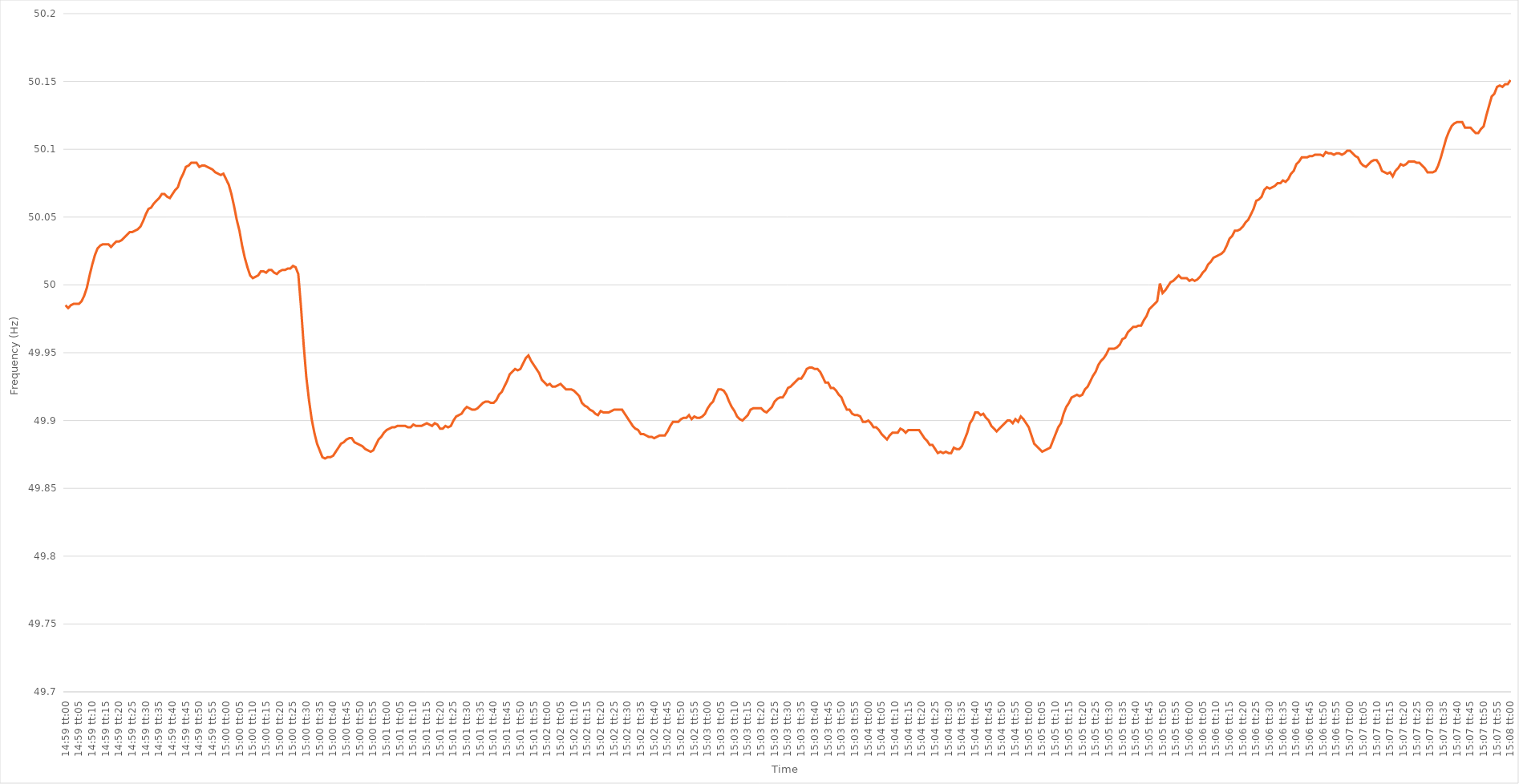
| Category | Series 0 |
|---|---|
| 0.6243055555555556 | 49.985 |
| 0.6243171296296296 | 49.983 |
| 0.6243287037037036 | 49.985 |
| 0.6243402777777778 | 49.986 |
| 0.6243518518518518 | 49.986 |
| 0.624363425925926 | 49.986 |
| 0.624375 | 49.988 |
| 0.624386574074074 | 49.992 |
| 0.6243981481481481 | 49.998 |
| 0.6244097222222222 | 50.007 |
| 0.6244212962962963 | 50.015 |
| 0.6244328703703704 | 50.022 |
| 0.6244444444444445 | 50.027 |
| 0.6244560185185185 | 50.029 |
| 0.6244675925925925 | 50.03 |
| 0.6244791666666667 | 50.03 |
| 0.6244907407407407 | 50.03 |
| 0.6245023148148149 | 50.028 |
| 0.6245138888888889 | 50.03 |
| 0.624525462962963 | 50.032 |
| 0.624537037037037 | 50.032 |
| 0.624548611111111 | 50.033 |
| 0.6245601851851852 | 50.035 |
| 0.6245717592592592 | 50.037 |
| 0.6245833333333334 | 50.039 |
| 0.6245949074074074 | 50.039 |
| 0.6246064814814815 | 50.04 |
| 0.6246180555555555 | 50.041 |
| 0.6246296296296296 | 50.043 |
| 0.6246412037037037 | 50.047 |
| 0.6246527777777778 | 50.052 |
| 0.6246643518518519 | 50.056 |
| 0.6246759259259259 | 50.057 |
| 0.6246875 | 50.06 |
| 0.6246990740740741 | 50.062 |
| 0.6247106481481481 | 50.064 |
| 0.6247222222222223 | 50.067 |
| 0.6247337962962963 | 50.067 |
| 0.6247453703703704 | 50.065 |
| 0.6247569444444444 | 50.064 |
| 0.6247685185185184 | 50.067 |
| 0.6247800925925926 | 50.07 |
| 0.6247916666666666 | 50.072 |
| 0.6248032407407408 | 50.078 |
| 0.6248148148148148 | 50.082 |
| 0.6248263888888889 | 50.087 |
| 0.6248379629629629 | 50.088 |
| 0.624849537037037 | 50.09 |
| 0.6248611111111111 | 50.09 |
| 0.6248726851851852 | 50.09 |
| 0.6248842592592593 | 50.087 |
| 0.6248958333333333 | 50.088 |
| 0.6249074074074074 | 50.088 |
| 0.6249189814814815 | 50.087 |
| 0.6249305555555555 | 50.086 |
| 0.6249421296296297 | 50.085 |
| 0.6249537037037037 | 50.083 |
| 0.6249652777777778 | 50.082 |
| 0.6249768518518518 | 50.081 |
| 0.624988425925926 | 50.082 |
| 0.625 | 50.078 |
| 0.625011574074074 | 50.074 |
| 0.6250231481481482 | 50.067 |
| 0.6250347222222222 | 50.058 |
| 0.6250462962962963 | 50.048 |
| 0.6250578703703703 | 50.04 |
| 0.6250694444444445 | 50.029 |
| 0.6250810185185185 | 50.02 |
| 0.6250925925925926 | 50.013 |
| 0.6251041666666667 | 50.007 |
| 0.6251157407407407 | 50.005 |
| 0.6251273148148148 | 50.006 |
| 0.6251388888888889 | 50.007 |
| 0.625150462962963 | 50.01 |
| 0.6251620370370371 | 50.01 |
| 0.6251736111111111 | 50.009 |
| 0.6251851851851852 | 50.011 |
| 0.6251967592592592 | 50.011 |
| 0.6252083333333334 | 50.009 |
| 0.6252199074074074 | 50.008 |
| 0.6252314814814816 | 50.01 |
| 0.6252430555555556 | 50.011 |
| 0.6252546296296296 | 50.011 |
| 0.6252662037037037 | 50.012 |
| 0.6252777777777777 | 50.012 |
| 0.6252893518518519 | 50.014 |
| 0.6253009259259259 | 50.013 |
| 0.6253125 | 50.008 |
| 0.6253240740740741 | 49.984 |
| 0.6253356481481481 | 49.956 |
| 0.6253472222222222 | 49.932 |
| 0.6253587962962963 | 49.915 |
| 0.6253703703703704 | 49.901 |
| 0.6253819444444445 | 49.891 |
| 0.6253935185185185 | 49.883 |
| 0.6254050925925926 | 49.878 |
| 0.6254166666666666 | 49.873 |
| 0.6254282407407408 | 49.872 |
| 0.6254398148148148 | 49.873 |
| 0.625451388888889 | 49.873 |
| 0.625462962962963 | 49.874 |
| 0.625474537037037 | 49.877 |
| 0.6254861111111111 | 49.88 |
| 0.6254976851851851 | 49.883 |
| 0.6255092592592593 | 49.884 |
| 0.6255208333333333 | 49.886 |
| 0.6255324074074075 | 49.887 |
| 0.6255439814814815 | 49.887 |
| 0.6255555555555555 | 49.884 |
| 0.6255671296296296 | 49.883 |
| 0.6255787037037037 | 49.882 |
| 0.6255902777777778 | 49.881 |
| 0.6256018518518519 | 49.879 |
| 0.625613425925926 | 49.878 |
| 0.625625 | 49.877 |
| 0.625636574074074 | 49.878 |
| 0.6256481481481482 | 49.882 |
| 0.6256597222222222 | 49.886 |
| 0.6256712962962964 | 49.888 |
| 0.6256828703703704 | 49.891 |
| 0.6256944444444444 | 49.893 |
| 0.6257060185185185 | 49.894 |
| 0.6257175925925925 | 49.895 |
| 0.6257291666666667 | 49.895 |
| 0.6257407407407407 | 49.896 |
| 0.6257523148148149 | 49.896 |
| 0.6257638888888889 | 49.896 |
| 0.6257754629629629 | 49.896 |
| 0.625787037037037 | 49.895 |
| 0.6257986111111111 | 49.895 |
| 0.6258101851851852 | 49.897 |
| 0.6258217592592593 | 49.896 |
| 0.6258333333333334 | 49.896 |
| 0.6258449074074074 | 49.896 |
| 0.6258564814814814 | 49.897 |
| 0.6258680555555556 | 49.898 |
| 0.6258796296296296 | 49.897 |
| 0.6258912037037038 | 49.896 |
| 0.6259027777777778 | 49.898 |
| 0.6259143518518518 | 49.897 |
| 0.6259259259259259 | 49.894 |
| 0.6259375 | 49.894 |
| 0.6259490740740741 | 49.896 |
| 0.6259606481481481 | 49.895 |
| 0.6259722222222223 | 49.896 |
| 0.6259837962962963 | 49.9 |
| 0.6259953703703703 | 49.903 |
| 0.6260069444444444 | 49.904 |
| 0.6260185185185185 | 49.905 |
| 0.6260300925925926 | 49.908 |
| 0.6260416666666667 | 49.91 |
| 0.6260532407407408 | 49.909 |
| 0.6260648148148148 | 49.908 |
| 0.6260763888888888 | 49.908 |
| 0.626087962962963 | 49.909 |
| 0.626099537037037 | 49.911 |
| 0.6261111111111112 | 49.913 |
| 0.6261226851851852 | 49.914 |
| 0.6261342592592593 | 49.914 |
| 0.6261458333333333 | 49.913 |
| 0.6261574074074074 | 49.913 |
| 0.6261689814814815 | 49.915 |
| 0.6261805555555556 | 49.919 |
| 0.6261921296296297 | 49.921 |
| 0.6262037037037037 | 49.925 |
| 0.6262152777777777 | 49.929 |
| 0.6262268518518518 | 49.934 |
| 0.6262384259259259 | 49.936 |
| 0.62625 | 49.938 |
| 0.6262615740740741 | 49.937 |
| 0.6262731481481482 | 49.938 |
| 0.6262847222222222 | 49.942 |
| 0.6262962962962962 | 49.946 |
| 0.6263078703703704 | 49.948 |
| 0.6263194444444444 | 49.944 |
| 0.6263310185185186 | 49.941 |
| 0.6263425925925926 | 49.938 |
| 0.6263541666666667 | 49.935 |
| 0.6263657407407407 | 49.93 |
| 0.6263773148148148 | 49.928 |
| 0.6263888888888889 | 49.926 |
| 0.626400462962963 | 49.927 |
| 0.6264120370370371 | 49.925 |
| 0.6264236111111111 | 49.925 |
| 0.6264351851851852 | 49.926 |
| 0.6264467592592592 | 49.927 |
| 0.6264583333333333 | 49.925 |
| 0.6264699074074074 | 49.923 |
| 0.6264814814814815 | 49.923 |
| 0.6264930555555556 | 49.923 |
| 0.6265046296296296 | 49.922 |
| 0.6265162037037036 | 49.92 |
| 0.6265277777777778 | 49.918 |
| 0.6265393518518518 | 49.913 |
| 0.626550925925926 | 49.911 |
| 0.6265625 | 49.91 |
| 0.6265740740740741 | 49.908 |
| 0.6265856481481481 | 49.907 |
| 0.6265972222222222 | 49.905 |
| 0.6266087962962963 | 49.904 |
| 0.6266203703703704 | 49.907 |
| 0.6266319444444445 | 49.906 |
| 0.6266435185185185 | 49.906 |
| 0.6266550925925926 | 49.906 |
| 0.6266666666666666 | 49.907 |
| 0.6266782407407407 | 49.908 |
| 0.6266898148148148 | 49.908 |
| 0.6267013888888889 | 49.908 |
| 0.626712962962963 | 49.908 |
| 0.626724537037037 | 49.905 |
| 0.626736111111111 | 49.902 |
| 0.6267476851851852 | 49.899 |
| 0.6267592592592592 | 49.896 |
| 0.6267708333333334 | 49.894 |
| 0.6267824074074074 | 49.893 |
| 0.6267939814814815 | 49.89 |
| 0.6268055555555555 | 49.89 |
| 0.6268171296296297 | 49.889 |
| 0.6268287037037037 | 49.888 |
| 0.6268402777777778 | 49.888 |
| 0.6268518518518519 | 49.887 |
| 0.6268634259259259 | 49.888 |
| 0.626875 | 49.889 |
| 0.6268865740740741 | 49.889 |
| 0.6268981481481481 | 49.889 |
| 0.6269097222222222 | 49.892 |
| 0.6269212962962963 | 49.896 |
| 0.6269328703703704 | 49.899 |
| 0.6269444444444444 | 49.899 |
| 0.6269560185185185 | 49.899 |
| 0.6269675925925926 | 49.901 |
| 0.6269791666666666 | 49.902 |
| 0.6269907407407408 | 49.902 |
| 0.6270023148148148 | 49.904 |
| 0.6270138888888889 | 49.901 |
| 0.6270254629629629 | 49.903 |
| 0.6270370370370371 | 49.902 |
| 0.6270486111111111 | 49.902 |
| 0.6270601851851852 | 49.903 |
| 0.6270717592592593 | 49.905 |
| 0.6270833333333333 | 49.909 |
| 0.6270949074074074 | 49.912 |
| 0.6271064814814815 | 49.914 |
| 0.6271180555555556 | 49.919 |
| 0.6271296296296297 | 49.923 |
| 0.6271412037037037 | 49.923 |
| 0.6271527777777778 | 49.922 |
| 0.6271643518518518 | 49.919 |
| 0.6271759259259259 | 49.914 |
| 0.6271875 | 49.91 |
| 0.627199074074074 | 49.907 |
| 0.6272106481481482 | 49.903 |
| 0.6272222222222222 | 49.901 |
| 0.6272337962962963 | 49.9 |
| 0.6272453703703703 | 49.902 |
| 0.6272569444444445 | 49.904 |
| 0.6272685185185185 | 49.908 |
| 0.6272800925925927 | 49.909 |
| 0.6272916666666667 | 49.909 |
| 0.6273032407407407 | 49.909 |
| 0.6273148148148148 | 49.909 |
| 0.6273263888888889 | 49.907 |
| 0.627337962962963 | 49.906 |
| 0.6273495370370371 | 49.908 |
| 0.6273611111111111 | 49.91 |
| 0.6273726851851852 | 49.914 |
| 0.6273842592592592 | 49.916 |
| 0.6273958333333333 | 49.917 |
| 0.6274074074074074 | 49.917 |
| 0.6274189814814815 | 49.92 |
| 0.6274305555555556 | 49.924 |
| 0.6274421296296296 | 49.925 |
| 0.6274537037037037 | 49.927 |
| 0.6274652777777777 | 49.929 |
| 0.6274768518518519 | 49.931 |
| 0.6274884259259259 | 49.931 |
| 0.6275000000000001 | 49.934 |
| 0.6275115740740741 | 49.938 |
| 0.6275231481481481 | 49.939 |
| 0.6275347222222222 | 49.939 |
| 0.6275462962962963 | 49.938 |
| 0.6275578703703704 | 49.938 |
| 0.6275694444444445 | 49.936 |
| 0.6275810185185186 | 49.932 |
| 0.6275925925925926 | 49.928 |
| 0.6276041666666666 | 49.928 |
| 0.6276157407407407 | 49.924 |
| 0.6276273148148148 | 49.924 |
| 0.6276388888888889 | 49.922 |
| 0.627650462962963 | 49.919 |
| 0.627662037037037 | 49.917 |
| 0.6276736111111111 | 49.912 |
| 0.6276851851851851 | 49.908 |
| 0.6276967592592593 | 49.908 |
| 0.6277083333333333 | 49.905 |
| 0.6277199074074075 | 49.904 |
| 0.6277314814814815 | 49.904 |
| 0.6277430555555555 | 49.903 |
| 0.6277546296296296 | 49.899 |
| 0.6277662037037037 | 49.899 |
| 0.6277777777777778 | 49.9 |
| 0.6277893518518519 | 49.898 |
| 0.627800925925926 | 49.895 |
| 0.6278125 | 49.895 |
| 0.627824074074074 | 49.893 |
| 0.6278356481481482 | 49.89 |
| 0.6278472222222222 | 49.888 |
| 0.6278587962962963 | 49.886 |
| 0.6278703703703704 | 49.889 |
| 0.6278819444444445 | 49.891 |
| 0.6278935185185185 | 49.891 |
| 0.6279050925925925 | 49.891 |
| 0.6279166666666667 | 49.894 |
| 0.6279282407407407 | 49.893 |
| 0.6279398148148149 | 49.891 |
| 0.6279513888888889 | 49.893 |
| 0.627962962962963 | 49.893 |
| 0.627974537037037 | 49.893 |
| 0.6279861111111111 | 49.893 |
| 0.6279976851851852 | 49.893 |
| 0.6280092592592593 | 49.89 |
| 0.6280208333333334 | 49.887 |
| 0.6280324074074074 | 49.885 |
| 0.6280439814814814 | 49.882 |
| 0.6280555555555556 | 49.882 |
| 0.6280671296296296 | 49.879 |
| 0.6280787037037037 | 49.876 |
| 0.6280902777777778 | 49.877 |
| 0.6281018518518519 | 49.876 |
| 0.6281134259259259 | 49.877 |
| 0.6281249999999999 | 49.876 |
| 0.6281365740740741 | 49.876 |
| 0.6281481481481481 | 49.88 |
| 0.6281597222222223 | 49.879 |
| 0.6281712962962963 | 49.879 |
| 0.6281828703703703 | 49.881 |
| 0.6281944444444444 | 49.886 |
| 0.6282060185185185 | 49.891 |
| 0.6282175925925926 | 49.898 |
| 0.6282291666666667 | 49.901 |
| 0.6282407407407408 | 49.906 |
| 0.6282523148148148 | 49.906 |
| 0.6282638888888888 | 49.904 |
| 0.628275462962963 | 49.905 |
| 0.628287037037037 | 49.902 |
| 0.6282986111111112 | 49.9 |
| 0.6283101851851852 | 49.896 |
| 0.6283217592592593 | 49.894 |
| 0.6283333333333333 | 49.892 |
| 0.6283449074074073 | 49.894 |
| 0.6283564814814815 | 49.896 |
| 0.6283680555555555 | 49.898 |
| 0.6283796296296297 | 49.9 |
| 0.6283912037037037 | 49.9 |
| 0.6284027777777778 | 49.898 |
| 0.6284143518518518 | 49.901 |
| 0.6284259259259259 | 49.899 |
| 0.6284375 | 49.903 |
| 0.6284490740740741 | 49.901 |
| 0.6284606481481482 | 49.898 |
| 0.6284722222222222 | 49.895 |
| 0.6284837962962962 | 49.889 |
| 0.6284953703703704 | 49.883 |
| 0.6285069444444444 | 49.881 |
| 0.6285185185185186 | 49.879 |
| 0.6285300925925926 | 49.877 |
| 0.6285416666666667 | 49.878 |
| 0.6285532407407407 | 49.879 |
| 0.6285648148148147 | 49.88 |
| 0.6285763888888889 | 49.885 |
| 0.6285879629629629 | 49.89 |
| 0.6285995370370371 | 49.895 |
| 0.6286111111111111 | 49.898 |
| 0.6286226851851852 | 49.905 |
| 0.6286342592592592 | 49.91 |
| 0.6286458333333333 | 49.913 |
| 0.6286574074074074 | 49.917 |
| 0.6286689814814815 | 49.918 |
| 0.6286805555555556 | 49.919 |
| 0.6286921296296296 | 49.918 |
| 0.6287037037037037 | 49.919 |
| 0.6287152777777778 | 49.923 |
| 0.6287268518518518 | 49.925 |
| 0.628738425925926 | 49.929 |
| 0.62875 | 49.933 |
| 0.6287615740740741 | 49.936 |
| 0.6287731481481481 | 49.941 |
| 0.6287847222222223 | 49.944 |
| 0.6287962962962963 | 49.946 |
| 0.6288078703703703 | 49.949 |
| 0.6288194444444445 | 49.953 |
| 0.6288310185185185 | 49.953 |
| 0.6288425925925926 | 49.953 |
| 0.6288541666666666 | 49.954 |
| 0.6288657407407408 | 49.956 |
| 0.6288773148148148 | 49.96 |
| 0.6288888888888889 | 49.961 |
| 0.628900462962963 | 49.965 |
| 0.628912037037037 | 49.967 |
| 0.6289236111111111 | 49.969 |
| 0.6289351851851852 | 49.969 |
| 0.6289467592592592 | 49.97 |
| 0.6289583333333334 | 49.97 |
| 0.6289699074074074 | 49.974 |
| 0.6289814814814815 | 49.977 |
| 0.6289930555555555 | 49.982 |
| 0.6290046296296297 | 49.984 |
| 0.6290162037037037 | 49.986 |
| 0.6290277777777777 | 49.988 |
| 0.6290393518518519 | 50.001 |
| 0.6290509259259259 | 49.994 |
| 0.6290625 | 49.996 |
| 0.629074074074074 | 49.999 |
| 0.6290856481481482 | 50.002 |
| 0.6290972222222222 | 50.003 |
| 0.6291087962962963 | 50.005 |
| 0.6291203703703704 | 50.007 |
| 0.6291319444444444 | 50.005 |
| 0.6291435185185185 | 50.005 |
| 0.6291550925925926 | 50.005 |
| 0.6291666666666667 | 50.003 |
| 0.6291782407407408 | 50.004 |
| 0.6291898148148148 | 50.003 |
| 0.6292013888888889 | 50.004 |
| 0.6292129629629629 | 50.006 |
| 0.6292245370370371 | 50.009 |
| 0.6292361111111111 | 50.011 |
| 0.6292476851851853 | 50.015 |
| 0.6292592592592593 | 50.017 |
| 0.6292708333333333 | 50.02 |
| 0.6292824074074074 | 50.021 |
| 0.6292939814814814 | 50.022 |
| 0.6293055555555556 | 50.023 |
| 0.6293171296296296 | 50.025 |
| 0.6293287037037038 | 50.029 |
| 0.6293402777777778 | 50.034 |
| 0.6293518518518518 | 50.036 |
| 0.6293634259259259 | 50.04 |
| 0.629375 | 50.04 |
| 0.6293865740740741 | 50.041 |
| 0.6293981481481482 | 50.043 |
| 0.6294097222222222 | 50.046 |
| 0.6294212962962963 | 50.048 |
| 0.6294328703703703 | 50.052 |
| 0.6294444444444445 | 50.056 |
| 0.6294560185185185 | 50.062 |
| 0.6294675925925927 | 50.063 |
| 0.6294791666666667 | 50.065 |
| 0.6294907407407407 | 50.07 |
| 0.6295023148148148 | 50.072 |
| 0.6295138888888888 | 50.071 |
| 0.629525462962963 | 50.072 |
| 0.629537037037037 | 50.073 |
| 0.6295486111111112 | 50.075 |
| 0.6295601851851852 | 50.075 |
| 0.6295717592592592 | 50.077 |
| 0.6295833333333333 | 50.076 |
| 0.6295949074074074 | 50.078 |
| 0.6296064814814815 | 50.082 |
| 0.6296180555555556 | 50.084 |
| 0.6296296296296297 | 50.089 |
| 0.6296412037037037 | 50.091 |
| 0.6296527777777777 | 50.094 |
| 0.6296643518518519 | 50.094 |
| 0.6296759259259259 | 50.094 |
| 0.6296875000000001 | 50.095 |
| 0.6296990740740741 | 50.095 |
| 0.6297106481481481 | 50.096 |
| 0.6297222222222222 | 50.096 |
| 0.6297337962962963 | 50.096 |
| 0.6297453703703704 | 50.095 |
| 0.6297569444444444 | 50.098 |
| 0.6297685185185186 | 50.097 |
| 0.6297800925925926 | 50.097 |
| 0.6297916666666666 | 50.096 |
| 0.6298032407407407 | 50.097 |
| 0.6298148148148148 | 50.097 |
| 0.6298263888888889 | 50.096 |
| 0.629837962962963 | 50.097 |
| 0.629849537037037 | 50.099 |
| 0.6298611111111111 | 50.099 |
| 0.6298726851851851 | 50.097 |
| 0.6298842592592593 | 50.095 |
| 0.6298958333333333 | 50.094 |
| 0.6299074074074075 | 50.09 |
| 0.6299189814814815 | 50.088 |
| 0.6299305555555555 | 50.087 |
| 0.6299421296296296 | 50.089 |
| 0.6299537037037037 | 50.091 |
| 0.6299652777777778 | 50.092 |
| 0.6299768518518518 | 50.092 |
| 0.629988425925926 | 50.089 |
| 0.63 | 50.084 |
| 0.630011574074074 | 50.083 |
| 0.6300231481481481 | 50.082 |
| 0.6300347222222222 | 50.083 |
| 0.6300462962962963 | 50.08 |
| 0.6300578703703704 | 50.084 |
| 0.6300694444444445 | 50.086 |
| 0.6300810185185185 | 50.089 |
| 0.6300925925925925 | 50.088 |
| 0.6301041666666667 | 50.089 |
| 0.6301157407407407 | 50.091 |
| 0.6301273148148149 | 50.091 |
| 0.6301388888888889 | 50.091 |
| 0.630150462962963 | 50.09 |
| 0.630162037037037 | 50.09 |
| 0.6301736111111111 | 50.088 |
| 0.6301851851851852 | 50.086 |
| 0.6301967592592593 | 50.083 |
| 0.6302083333333334 | 50.083 |
| 0.6302199074074074 | 50.083 |
| 0.6302314814814814 | 50.084 |
| 0.6302430555555555 | 50.088 |
| 0.6302546296296296 | 50.094 |
| 0.6302662037037037 | 50.101 |
| 0.6302777777777778 | 50.108 |
| 0.6302893518518519 | 50.113 |
| 0.6303009259259259 | 50.117 |
| 0.6303124999999999 | 50.119 |
| 0.6303240740740741 | 50.12 |
| 0.6303356481481481 | 50.12 |
| 0.6303472222222223 | 50.12 |
| 0.6303587962962963 | 50.116 |
| 0.6303703703703704 | 50.116 |
| 0.6303819444444444 | 50.116 |
| 0.6303935185185185 | 50.114 |
| 0.6304050925925926 | 50.112 |
| 0.6304166666666667 | 50.112 |
| 0.6304282407407408 | 50.115 |
| 0.6304398148148148 | 50.117 |
| 0.6304513888888889 | 50.125 |
| 0.6304629629629629 | 50.132 |
| 0.630474537037037 | 50.139 |
| 0.6304861111111111 | 50.141 |
| 0.6304976851851852 | 50.146 |
| 0.6305092592592593 | 50.147 |
| 0.6305208333333333 | 50.146 |
| 0.6305324074074073 | 50.148 |
| 0.6305439814814815 | 50.148 |
| 0.6305555555555555 | 50.151 |